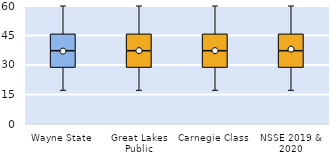
| Category | 25th | 50th | 75th |
|---|---|---|---|
| Wayne State | 28.571 | 8.571 | 8.571 |
| Great Lakes Public | 28.571 | 8.571 | 8.571 |
| Carnegie Class | 28.571 | 8.571 | 8.571 |
| NSSE 2019 & 2020 | 28.571 | 8.571 | 8.571 |